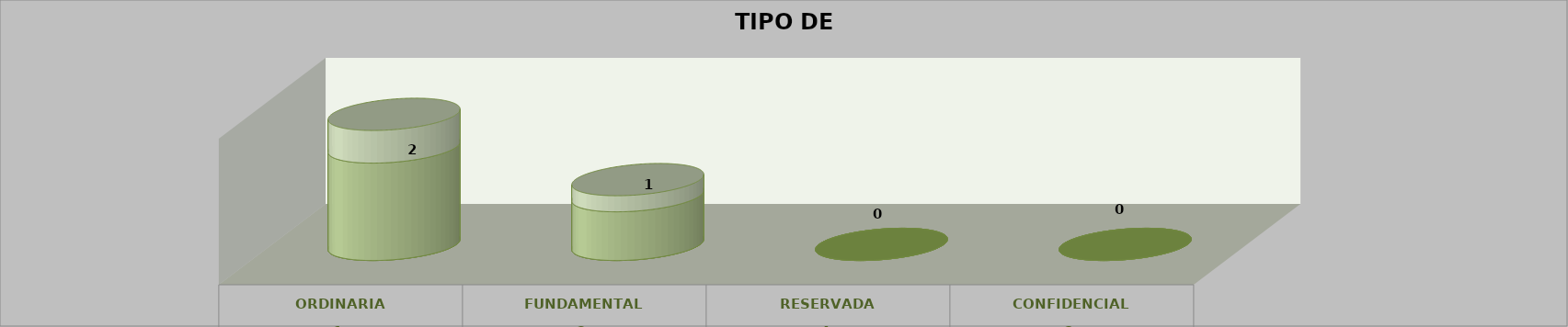
| Category | Series 0 | Series 2 | Series 1 | Series 3 | Series 4 |
|---|---|---|---|---|---|
| 0 |  |  |  | 2 | 0.67 |
| 1 |  |  |  | 1 | 0.33 |
| 2 |  |  |  | 0 | 0 |
| 3 |  |  |  | 0 | 0 |